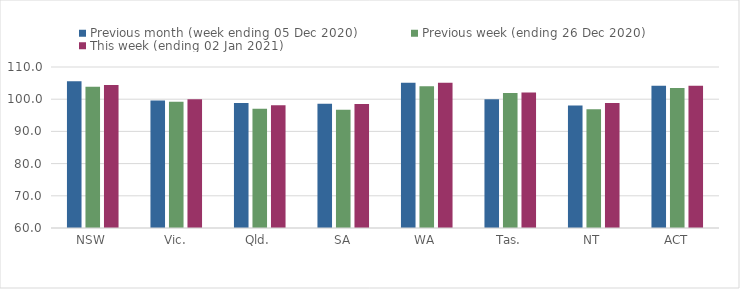
| Category | Previous month (week ending 05 Dec 2020) | Previous week (ending 26 Dec 2020) | This week (ending 02 Jan 2021) |
|---|---|---|---|
| NSW | 105.55 | 103.89 | 104.44 |
| Vic. | 99.63 | 99.18 | 99.95 |
| Qld. | 98.83 | 97 | 98.1 |
| SA | 98.61 | 96.76 | 98.54 |
| WA | 105.14 | 104.06 | 105.13 |
| Tas. | 100 | 101.92 | 102.1 |
| NT | 98.07 | 96.86 | 98.8 |
| ACT | 104.21 | 103.51 | 104.15 |